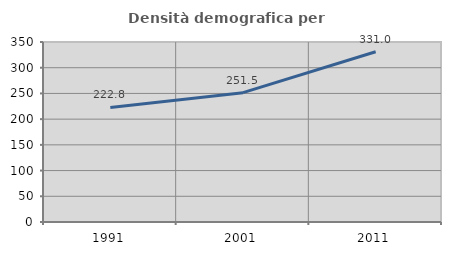
| Category | Densità demografica |
|---|---|
| 1991.0 | 222.789 |
| 2001.0 | 251.48 |
| 2011.0 | 331.013 |